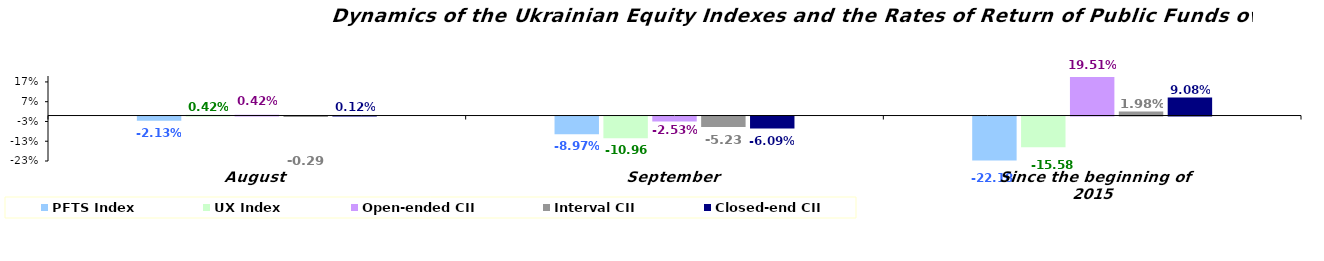
| Category | PFTS Index | UX Index | Open-ended CII | Interval CII | Closed-end CII |
|---|---|---|---|---|---|
| August | -0.021 | 0.004 | 0.004 | -0.003 | 0.001 |
| September | -0.09 | -0.11 | -0.025 | -0.052 | -0.061 |
| Since the beginning of 2015 | -0.222 | -0.156 | 0.195 | 0.02 | 0.091 |